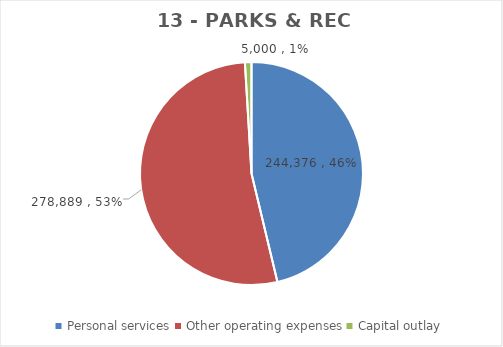
| Category | Series 0 | Series 1 | Series 2 | Series 3 | Series 4 | Series 5 | Series 6 | Series 7 |
|---|---|---|---|---|---|---|---|---|
| Personal services | 244376 |  |  | 231533 | 246602 | 244376 | 244376 | 0 |
| Other operating expenses | 278889 |  |  | 269711 | 278686 | 275254 | 278889 | 0 |
| Capital outlay | 5000 |  |  | 211609 | 37500 | 235000 | 5000 | 0 |